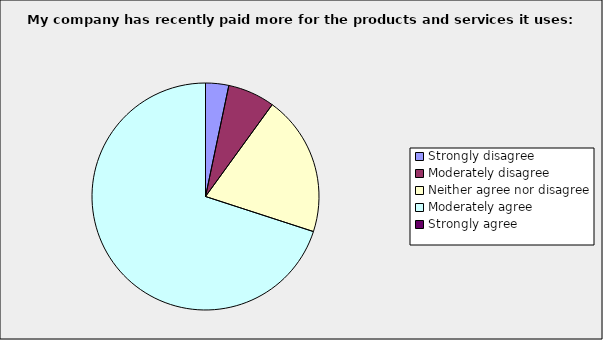
| Category | Series 0 |
|---|---|
| Strongly disagree | 0.033 |
| Moderately disagree | 0.067 |
| Neither agree nor disagree | 0.2 |
| Moderately agree | 0.7 |
| Strongly agree | 0 |